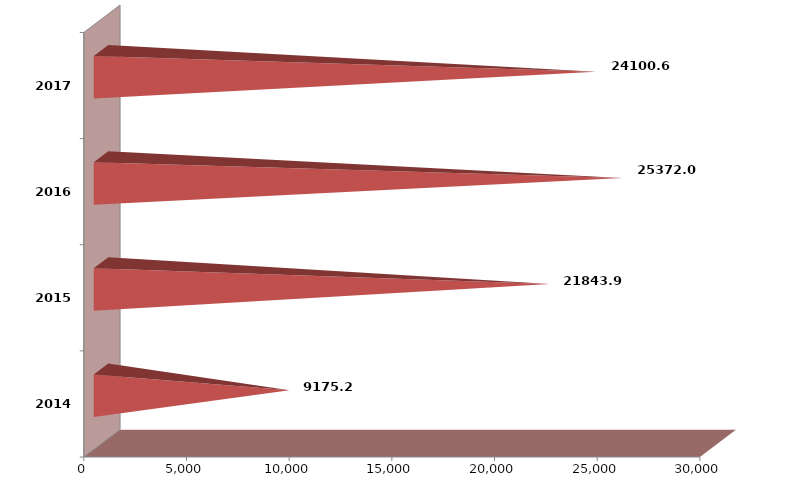
| Category | Series 1 |
|---|---|
| 2014 | 9175182 |
| 2015 | 21843939 |
| 2016 | 25371970 |
| 2017 | 24100596 |